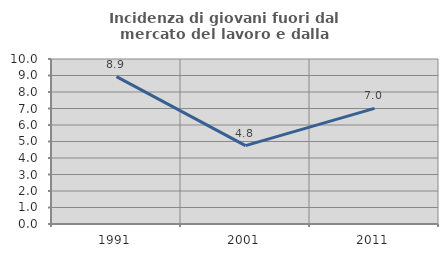
| Category | Incidenza di giovani fuori dal mercato del lavoro e dalla formazione  |
|---|---|
| 1991.0 | 8.932 |
| 2001.0 | 4.752 |
| 2011.0 | 7.006 |